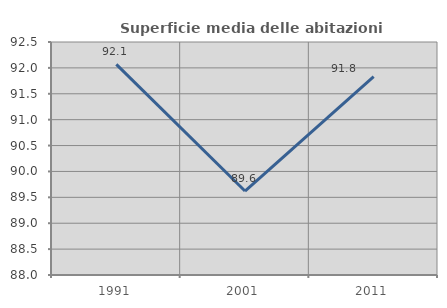
| Category | Superficie media delle abitazioni occupate |
|---|---|
| 1991.0 | 92.068 |
| 2001.0 | 89.622 |
| 2011.0 | 91.832 |